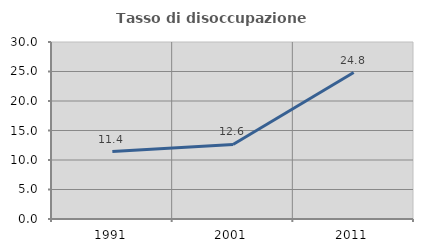
| Category | Tasso di disoccupazione giovanile  |
|---|---|
| 1991.0 | 11.422 |
| 2001.0 | 12.632 |
| 2011.0 | 24.828 |